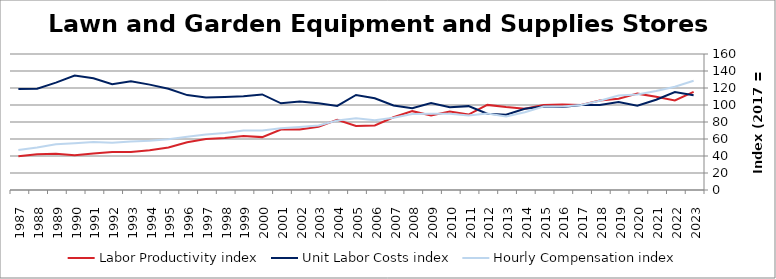
| Category | Labor Productivity index | Unit Labor Costs index | Hourly Compensation index |
|---|---|---|---|
| 2023.0 | 115.414 | 111.377 | 128.545 |
| 2022.0 | 105.373 | 115.32 | 121.516 |
| 2021.0 | 109.691 | 106.184 | 116.475 |
| 2020.0 | 113.365 | 99.194 | 112.45 |
| 2019.0 | 107.414 | 103.549 | 111.227 |
| 2018.0 | 105.185 | 99.907 | 105.088 |
| 2017.0 | 100 | 100 | 100 |
| 2016.0 | 100.697 | 97.505 | 98.184 |
| 2015.0 | 99.954 | 98.284 | 98.239 |
| 2014.0 | 95.67 | 95.585 | 91.446 |
| 2013.0 | 97.608 | 88.623 | 86.503 |
| 2012.0 | 100.133 | 89.758 | 89.877 |
| 2011.0 | 88.743 | 98.664 | 87.558 |
| 2010.0 | 92.292 | 97.263 | 89.766 |
| 2009.0 | 87.763 | 102.262 | 89.748 |
| 2008.0 | 92.755 | 96.252 | 89.278 |
| 2007.0 | 85.529 | 99.444 | 85.053 |
| 2006.0 | 76.001 | 107.931 | 82.029 |
| 2005.0 | 75.402 | 111.816 | 84.311 |
| 2004.0 | 82.581 | 98.912 | 81.683 |
| 2003.0 | 74.388 | 101.988 | 75.866 |
| 2002.0 | 71.252 | 104.215 | 74.255 |
| 2001.0 | 71.212 | 101.97 | 72.614 |
| 2000.0 | 62.209 | 112.461 | 69.961 |
| 1999.0 | 63.453 | 110.252 | 69.959 |
| 1998.0 | 61.289 | 109.386 | 67.042 |
| 1997.0 | 60.055 | 108.811 | 65.346 |
| 1996.0 | 56.058 | 111.638 | 62.582 |
| 1995.0 | 50.09 | 119.098 | 59.657 |
| 1994.0 | 46.638 | 123.968 | 57.816 |
| 1993.0 | 44.675 | 127.984 | 57.177 |
| 1992.0 | 44.751 | 124.543 | 55.735 |
| 1991.0 | 42.911 | 131.418 | 56.392 |
| 1990.0 | 40.953 | 134.605 | 55.125 |
| 1989.0 | 42.521 | 126.299 | 53.703 |
| 1988.0 | 42.001 | 119.256 | 50.088 |
| 1987.0 | 39.721 | 118.738 | 47.164 |